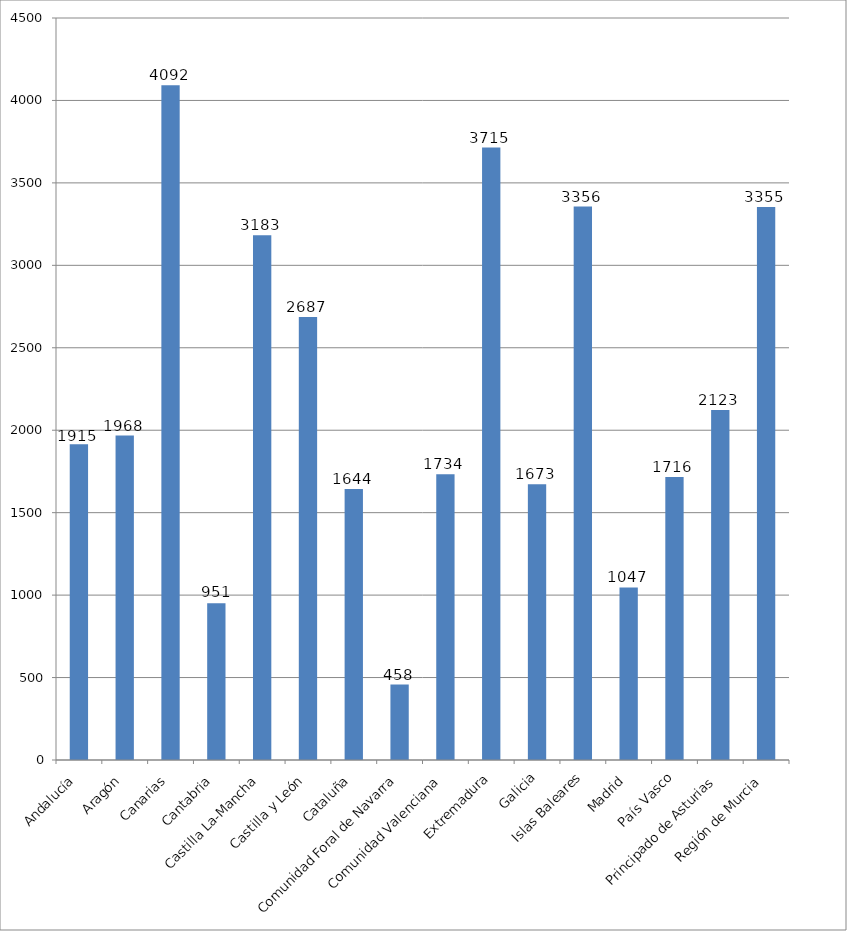
| Category | Total |
|---|---|
| Andalucía | 1914.733 |
| Aragón | 1967.667 |
| Canarias | 4091.8 |
| Cantabria | 951 |
| Castilla La-Mancha | 3182.667 |
| Castilla y León | 2687.2 |
| Cataluña | 1643.833 |
| Comunidad Foral de Navarra | 457.667 |
| Comunidad Valenciana | 1733.636 |
| Extremadura | 3714.5 |
| Galicia | 1673 |
| Islas Baleares | 3356.333 |
| Madrid | 1046.591 |
| País Vasco | 1716.2 |
| Principado de Asturias | 2123 |
| Región de Murcia | 3354.5 |